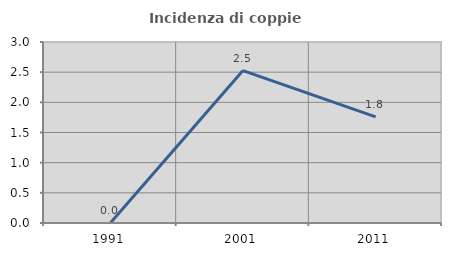
| Category | Incidenza di coppie miste |
|---|---|
| 1991.0 | 0 |
| 2001.0 | 2.526 |
| 2011.0 | 1.758 |